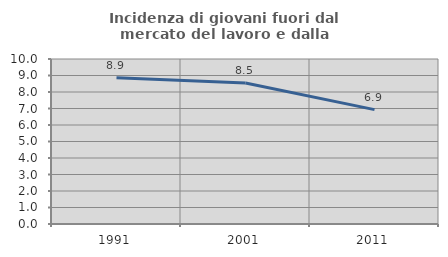
| Category | Incidenza di giovani fuori dal mercato del lavoro e dalla formazione  |
|---|---|
| 1991.0 | 8.87 |
| 2001.0 | 8.55 |
| 2011.0 | 6.93 |